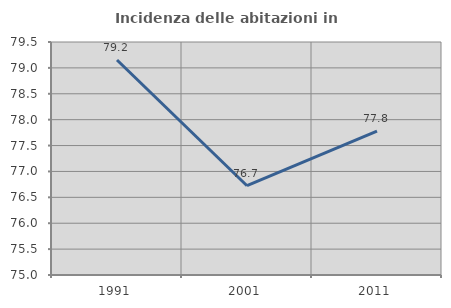
| Category | Incidenza delle abitazioni in proprietà  |
|---|---|
| 1991.0 | 79.153 |
| 2001.0 | 76.724 |
| 2011.0 | 77.778 |